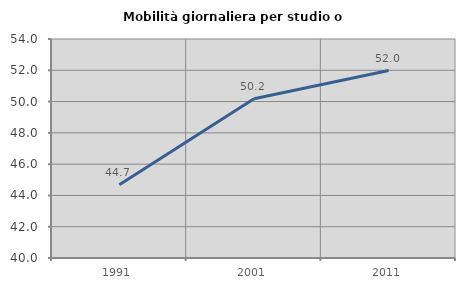
| Category | Mobilità giornaliera per studio o lavoro |
|---|---|
| 1991.0 | 44.679 |
| 2001.0 | 50.186 |
| 2011.0 | 51.986 |